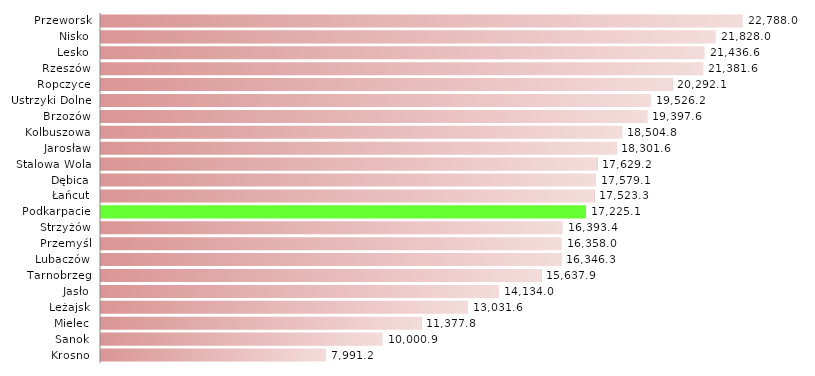
| Category | Roboty publiczne |
|---|---|
| Krosno | 7991.192 |
| Sanok | 10000.878 |
| Mielec | 11377.817 |
| Leżajsk | 13031.565 |
| Jasło | 14134.02 |
| Tarnobrzeg | 15637.929 |
| Lubaczów | 16346.3 |
| Przemyśl | 16358.022 |
| Strzyżów | 16393.418 |
| Podkarpacie | 17225.129 |
| Łańcut | 17523.311 |
| Dębica | 17579.073 |
| Stalowa Wola | 17629.184 |
| Jarosław | 18301.62 |
| Kolbuszowa | 18504.821 |
| Brzozów | 19397.624 |
| Ustrzyki Dolne | 19526.167 |
| Ropczyce | 20292.109 |
| Rzeszów | 21381.615 |
| Lesko | 21436.602 |
| Nisko | 21828.018 |
| Przeworsk | 22787.972 |